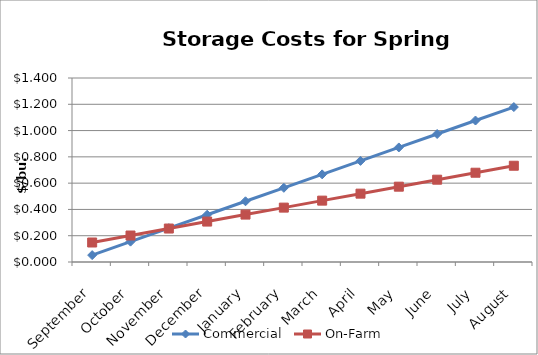
| Category | Commercial | On-Farm |
|---|---|---|
| September | 0.052 | 0.148 |
| October | 0.155 | 0.201 |
| November | 0.257 | 0.255 |
| December | 0.36 | 0.308 |
| January | 0.462 | 0.361 |
| February | 0.564 | 0.414 |
| March | 0.667 | 0.467 |
| April | 0.769 | 0.52 |
| May | 0.872 | 0.573 |
| June | 0.974 | 0.626 |
| July | 1.076 | 0.679 |
| August | 1.179 | 0.732 |